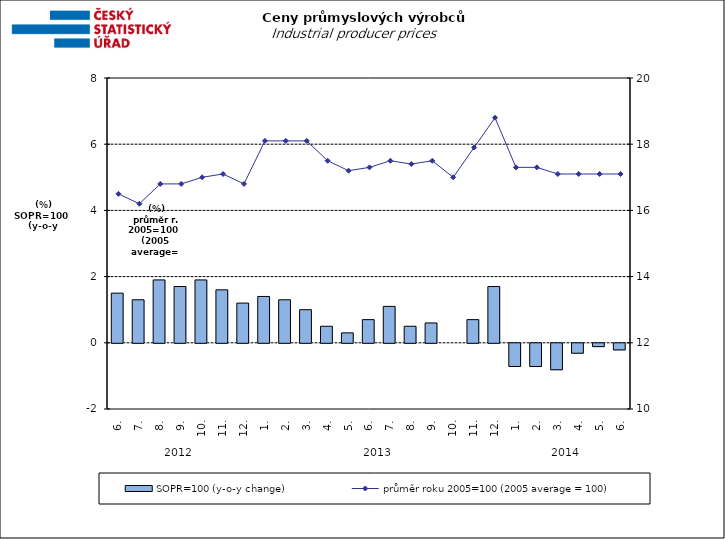
| Category | SOPR=100 (y-o-y change)   |
|---|---|
| 0 | 1.5 |
| 1 | 1.3 |
| 2 | 1.9 |
| 3 | 1.7 |
| 4 | 1.9 |
| 5 | 1.6 |
| 6 | 1.2 |
| 7 | 1.4 |
| 8 | 1.3 |
| 9 | 1 |
| 10 | 0.5 |
| 11 | 0.3 |
| 12 | 0.7 |
| 13 | 1.1 |
| 14 | 0.5 |
| 15 | 0.6 |
| 16 | 0 |
| 17 | 0.7 |
| 18 | 1.7 |
| 19 | -0.7 |
| 20 | -0.7 |
| 21 | -0.8 |
| 22 | -0.3 |
| 23 | -0.1 |
| 24 | -0.2 |